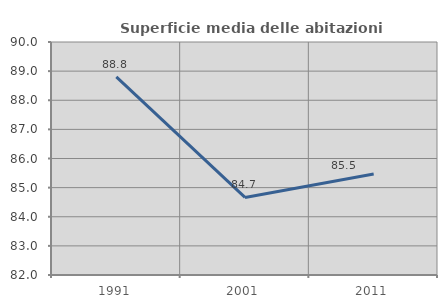
| Category | Superficie media delle abitazioni occupate |
|---|---|
| 1991.0 | 88.803 |
| 2001.0 | 84.664 |
| 2011.0 | 85.471 |